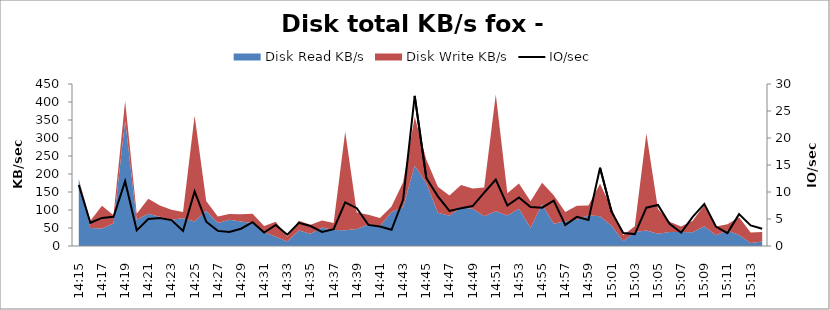
| Category | IO/sec |
|---|---|
| 0 | 11.3 |
| 00:00 | 4.3 |
| 00:00 | 5.2 |
| 00:00 | 5.4 |
| 00:00 | 12 |
| 00:00 | 2.9 |
| 00:00 | 5 |
| 00:00 | 5.2 |
| 00:00 | 4.8 |
| 00:00 | 2.8 |
| 00:00 | 10.1 |
| 00:00 | 4.5 |
| 00:00 | 2.8 |
| 00:00 | 2.6 |
| 00:00 | 3.2 |
| 00:00 | 4.4 |
| 00:00 | 2.5 |
| 00:00 | 3.9 |
| 00:00 | 2.1 |
| 00:00 | 4.3 |
| 00:00 | 3.7 |
| 00:00 | 2.6 |
| 00:00 | 3.1 |
| 00:00 | 8.1 |
| 00:00 | 7 |
| 00:00 | 3.9 |
| 00:00 | 3.6 |
| 00:00 | 3 |
| 00:00 | 8.6 |
| 00:00 | 27.8 |
| 00:00 | 12.6 |
| 00:00 | 9.2 |
| 00:00 | 6.5 |
| 00:00 | 7 |
| 00:00 | 7.4 |
| 00:00 | 9.9 |
| 00:00 | 12.3 |
| 00:00 | 7.5 |
| 00:00 | 9 |
| 00:00 | 7.2 |
| 00:00 | 7.1 |
| 00:00 | 8.4 |
| 00:00 | 3.9 |
| 00:00 | 5.4 |
| 00:00 | 4.8 |
| 00:00 | 14.5 |
| 00:00 | 6.3 |
| 00:00 | 2.4 |
| 00:00 | 2.2 |
| 00:00 | 7.1 |
| 00:00 | 7.6 |
| 00:00 | 4.1 |
| 00:00 | 2.5 |
| 00:00 | 5.4 |
| 00:00 | 7.8 |
| 00:00 | 3.6 |
| 00:00 | 2.4 |
| 00:00 | 5.9 |
| 00:00 | 3.8 |
| 00:00 | 3.2 |